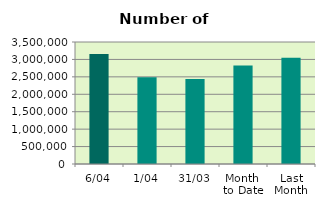
| Category | Series 0 |
|---|---|
| 6/04 | 3157238 |
| 1/04 | 2489136 |
| 31/03 | 2440498 |
| Month 
to Date | 2823187 |
| Last
Month | 3050763.217 |